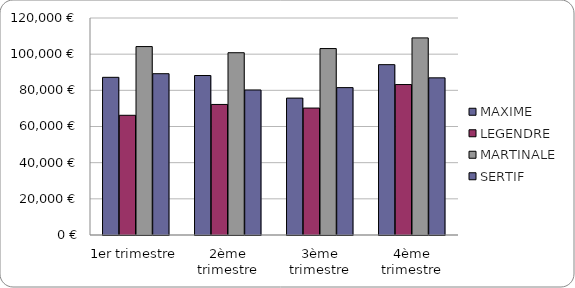
| Category | MAXIME | LEGENDRE | MARTINALE | SERTIF |
|---|---|---|---|---|
| 1er trimestre | 87200 | 66200 | 104200 | 89200 |
| 2ème trimestre | 88200 | 72200 | 100800 | 80200 |
| 3ème trimestre | 75700 | 70200 | 103100 | 81500 |
| 4ème trimestre | 94200 | 83200 | 109000 | 86900 |